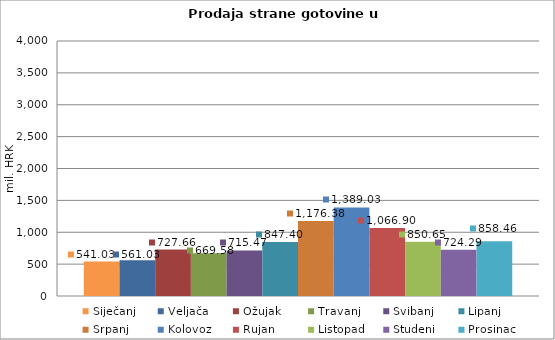
| Category | Siječanj | Veljača | Ožujak | Travanj | Svibanj | Lipanj | Srpanj | Kolovoz | Rujan | Listopad | Studeni | Prosinac |
|---|---|---|---|---|---|---|---|---|---|---|---|---|
| 0 | 541.03 | 561.029 | 727.659 | 669.578 | 715.469 | 847.399 | 1176.379 | 1389.033 | 1066.902 | 850.649 | 724.287 | 858.464 |